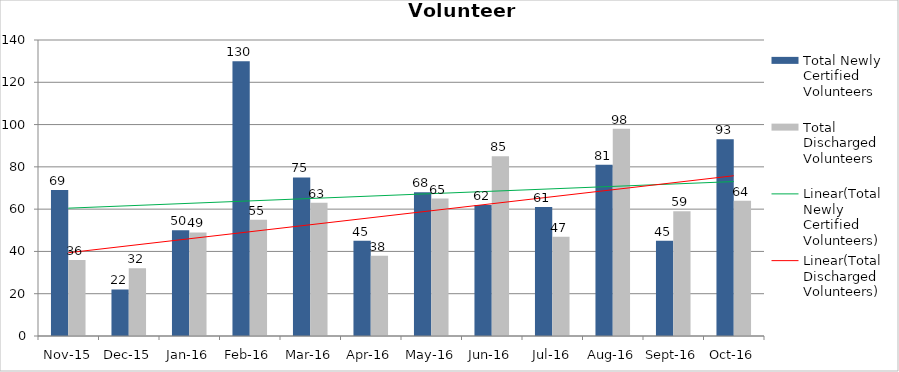
| Category | Total Newly Certified Volunteers | Total Discharged Volunteers |
|---|---|---|
| Nov-15 | 69 | 36 |
| Dec-15 | 22 | 32 |
| Jan-16 | 50 | 49 |
| Feb-16 | 130 | 55 |
| Mar-16 | 75 | 63 |
| Apr-16 | 45 | 38 |
| May-16 | 68 | 65 |
| Jun-16 | 62 | 85 |
| Jul-16 | 61 | 47 |
| Aug-16 | 81 | 98 |
| Sep-16 | 45 | 59 |
| Oct-16 | 93 | 64 |